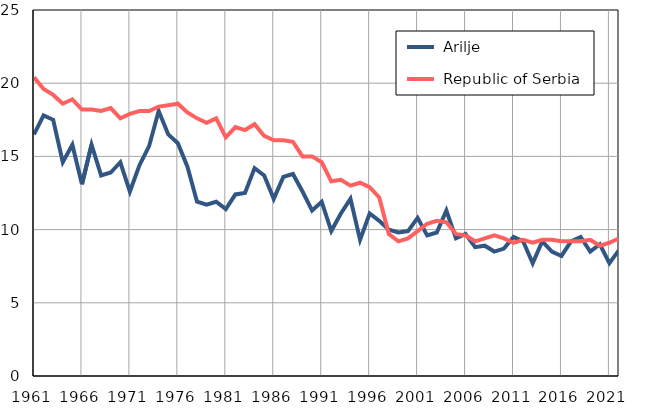
| Category |  Arilje |  Republic of Serbia |
|---|---|---|
| 1961.0 | 16.5 | 20.4 |
| 1962.0 | 17.8 | 19.6 |
| 1963.0 | 17.5 | 19.2 |
| 1964.0 | 14.6 | 18.6 |
| 1965.0 | 15.8 | 18.9 |
| 1966.0 | 13.1 | 18.2 |
| 1967.0 | 15.8 | 18.2 |
| 1968.0 | 13.7 | 18.1 |
| 1969.0 | 13.9 | 18.3 |
| 1970.0 | 14.6 | 17.6 |
| 1971.0 | 12.6 | 17.9 |
| 1972.0 | 14.4 | 18.1 |
| 1973.0 | 15.7 | 18.1 |
| 1974.0 | 18.1 | 18.4 |
| 1975.0 | 16.5 | 18.5 |
| 1976.0 | 15.9 | 18.6 |
| 1977.0 | 14.3 | 18 |
| 1978.0 | 11.9 | 17.6 |
| 1979.0 | 11.7 | 17.3 |
| 1980.0 | 11.9 | 17.6 |
| 1981.0 | 11.4 | 16.3 |
| 1982.0 | 12.4 | 17 |
| 1983.0 | 12.5 | 16.8 |
| 1984.0 | 14.2 | 17.2 |
| 1985.0 | 13.7 | 16.4 |
| 1986.0 | 12.1 | 16.1 |
| 1987.0 | 13.6 | 16.1 |
| 1988.0 | 13.8 | 16 |
| 1989.0 | 12.6 | 15 |
| 1990.0 | 11.3 | 15 |
| 1991.0 | 11.9 | 14.6 |
| 1992.0 | 9.9 | 13.3 |
| 1993.0 | 11.1 | 13.4 |
| 1994.0 | 12.1 | 13 |
| 1995.0 | 9.3 | 13.2 |
| 1996.0 | 11.1 | 12.9 |
| 1997.0 | 10.6 | 12.2 |
| 1998.0 | 10 | 9.7 |
| 1999.0 | 9.8 | 9.2 |
| 2000.0 | 9.9 | 9.4 |
| 2001.0 | 10.8 | 9.9 |
| 2002.0 | 9.6 | 10.4 |
| 2003.0 | 9.8 | 10.6 |
| 2004.0 | 11.3 | 10.5 |
| 2005.0 | 9.4 | 9.7 |
| 2006.0 | 9.7 | 9.6 |
| 2007.0 | 8.8 | 9.2 |
| 2008.0 | 8.9 | 9.4 |
| 2009.0 | 8.5 | 9.6 |
| 2010.0 | 8.7 | 9.4 |
| 2011.0 | 9.5 | 9.1 |
| 2012.0 | 9.2 | 9.3 |
| 2013.0 | 7.7 | 9.1 |
| 2014.0 | 9.2 | 9.3 |
| 2015.0 | 8.5 | 9.3 |
| 2016.0 | 8.2 | 9.2 |
| 2017.0 | 9.2 | 9.2 |
| 2018.0 | 9.5 | 9.2 |
| 2019.0 | 8.5 | 9.3 |
| 2020.0 | 9 | 8.9 |
| 2021.0 | 7.7 | 9.1 |
| 2022.0 | 8.6 | 9.4 |